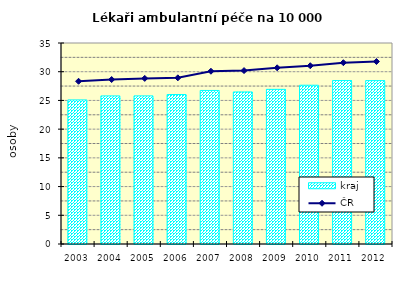
| Category | kraj |
|---|---|
| 2003.0 | 25.091 |
| 2004.0 | 25.787 |
| 2005.0 | 25.791 |
| 2006.0 | 26.029 |
| 2007.0 | 26.735 |
| 2008.0 | 26.478 |
| 2009.0 | 26.928 |
| 2010.0 | 27.647 |
| 2011.0 | 28.463 |
| 2012.0 | 28.45 |